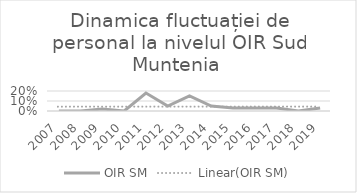
| Category | OIR SM |
|---|---|
| 2007.0 | 0 |
| 2008.0 | 0 |
| 2009.0 | 0.02 |
| 2010.0 | 0 |
| 2011.0 | 0.18 |
| 2012.0 | 0.05 |
| 2013.0 | 0.15 |
| 2014.0 | 0.05 |
| 2015.0 | 0.03 |
| 2016.0 | 0.03 |
| 2017.0 | 0.03 |
| 2018.0 | 0 |
| 2019.0 | 0.03 |